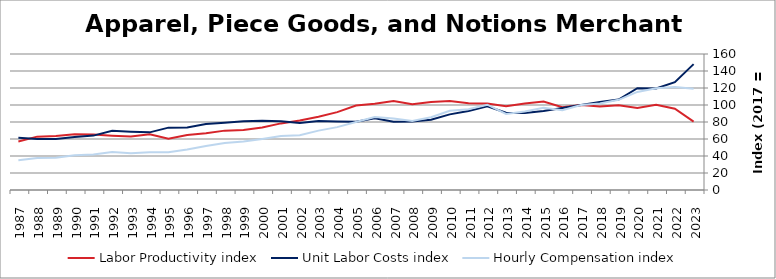
| Category | Labor Productivity index | Unit Labor Costs index | Hourly Compensation index |
|---|---|---|---|
| 2023.0 | 80.521 | 148.068 | 119.226 |
| 2022.0 | 95.641 | 126.787 | 121.259 |
| 2021.0 | 100.373 | 119.356 | 119.802 |
| 2020.0 | 96.37 | 119.695 | 115.35 |
| 2019.0 | 99.641 | 106.456 | 106.074 |
| 2018.0 | 98.286 | 103.424 | 101.652 |
| 2017.0 | 100 | 100 | 100 |
| 2016.0 | 97.369 | 96.517 | 93.978 |
| 2015.0 | 104.02 | 93.027 | 96.766 |
| 2014.0 | 101.79 | 90.61 | 92.231 |
| 2013.0 | 98.461 | 90.931 | 89.531 |
| 2012.0 | 101.837 | 98.539 | 100.349 |
| 2011.0 | 102.099 | 92.978 | 94.93 |
| 2010.0 | 104.695 | 88.953 | 93.13 |
| 2009.0 | 103.631 | 82.595 | 85.594 |
| 2008.0 | 100.782 | 80.665 | 81.296 |
| 2007.0 | 104.653 | 80.378 | 84.118 |
| 2006.0 | 101.494 | 84.499 | 85.761 |
| 2005.0 | 99.486 | 80.405 | 79.992 |
| 2004.0 | 91.648 | 80.716 | 73.975 |
| 2003.0 | 86.069 | 81.159 | 69.853 |
| 2002.0 | 81.853 | 78.685 | 64.406 |
| 2001.0 | 78.358 | 80.919 | 63.406 |
| 2000.0 | 73.632 | 81.45 | 59.974 |
| 1999.0 | 70.478 | 80.776 | 56.929 |
| 1998.0 | 69.847 | 78.995 | 55.176 |
| 1997.0 | 66.775 | 77.527 | 51.769 |
| 1996.0 | 64.668 | 73.66 | 47.635 |
| 1995.0 | 60.383 | 73.374 | 44.306 |
| 1994.0 | 65.591 | 67.81 | 44.477 |
| 1993.0 | 62.867 | 68.652 | 43.16 |
| 1992.0 | 63.876 | 69.758 | 44.559 |
| 1991.0 | 65.26 | 63.991 | 41.76 |
| 1990.0 | 65.505 | 62.415 | 40.885 |
| 1989.0 | 63.478 | 59.949 | 38.054 |
| 1988.0 | 62.777 | 60.014 | 37.675 |
| 1987.0 | 56.988 | 61.526 | 35.063 |